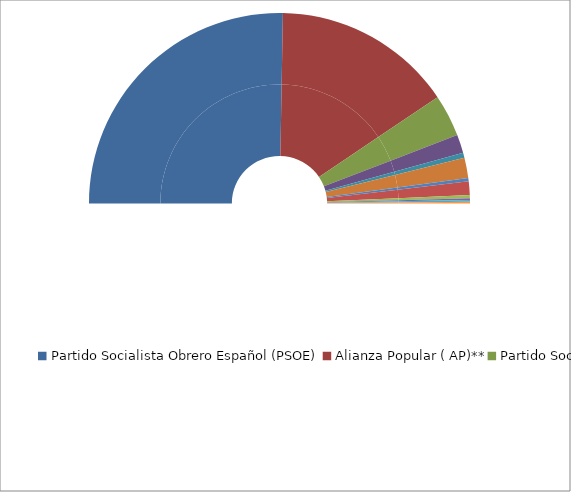
| Category | Series 0 | Partido Socialista Obrero Español (PSOE) |
|---|---|---|
| Partido Socialista Obrero Español (PSOE) | 177 | 50.571 |
| Alianza Popular ( AP)** | 107 | 30.571 |
| Partido Socialista de Catalunya (PSC) | 25 | 7.143 |
| Unión de Centro Democrático (UCD) | 11 | 3.143 |
| Partido Comunista de España (PCE) | 3 | 0.857 |
| Convergencia i Unió (CiU) | 12 | 3.429 |
| Centro Democrático y Social (CDS) | 2 | 0.571 |
| Partido Nacionalista Vasco (PNV) | 8 | 2.286 |
| Herri Batasuna (HB) | 2 | 0.571 |
| Partit Socialista Unificat de Catalunya (PSUC) | 1 | 0.286 |
| Esquerra Republicana de Catalunya (ERC) | 1 | 0.286 |
| Euskadiko Ezkerra (EE) | 1 | 0.286 |